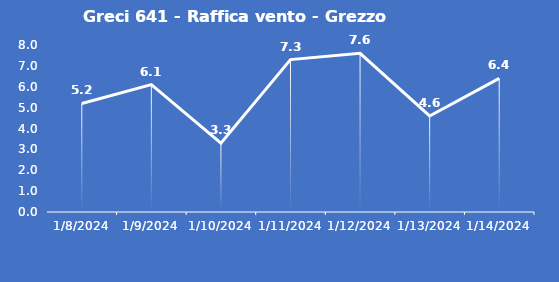
| Category | Greci 641 - Raffica vento - Grezzo (m/s) |
|---|---|
| 1/8/24 | 5.2 |
| 1/9/24 | 6.1 |
| 1/10/24 | 3.3 |
| 1/11/24 | 7.3 |
| 1/12/24 | 7.6 |
| 1/13/24 | 4.6 |
| 1/14/24 | 6.4 |